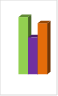
| Category | област Бургас |
|---|---|
| летен сезон 2019  | 9418227 |
| летен сезон 2021  | 6079234 |
| летен сезон 2022 г.  | 8411627 |